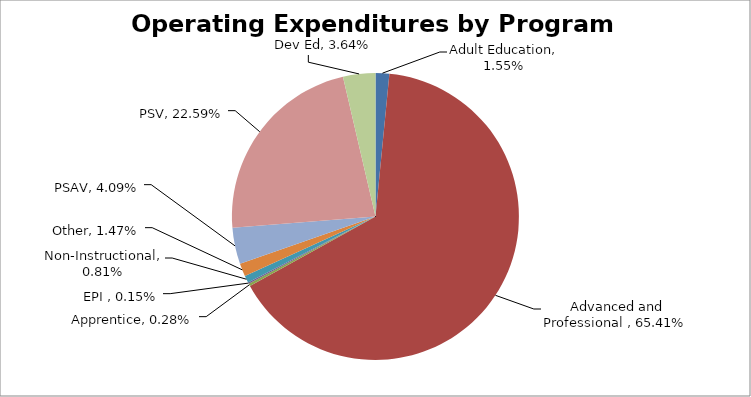
| Category | Series 0 |
|---|---|
| Adult Education | 0.015 |
| Advanced and Professional | 0.654 |
| Apprentice | 0.003 |
| EPI | 0.001 |
| Non-Instructional | 0.008 |
| Other | 0.015 |
| PSAV | 0.041 |
| PSV | 0.226 |
| Dev Ed | 0.036 |